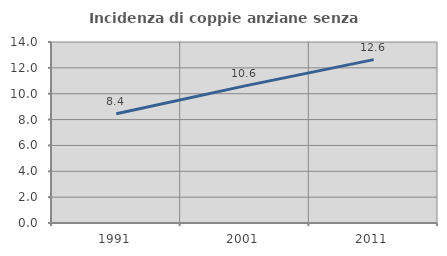
| Category | Incidenza di coppie anziane senza figli  |
|---|---|
| 1991.0 | 8.45 |
| 2001.0 | 10.607 |
| 2011.0 | 12.639 |